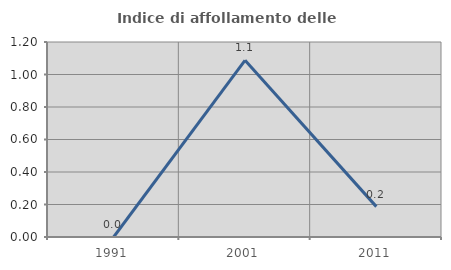
| Category | Indice di affollamento delle abitazioni  |
|---|---|
| 1991.0 | 0 |
| 2001.0 | 1.087 |
| 2011.0 | 0.187 |